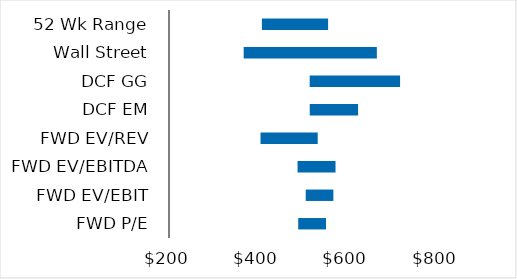
| Category | Series 0 | Series 1 | Series 2 |
|---|---|---|---|
| FWD P/E | 488.959 | 62.236 | 551.194 |
| FWD EV/EBIT | 505.742 | 62.383 | 568.125 |
| FWD EV/EBITDA | 487.494 | 85.383 | 572.877 |
| FWD EV/REV | 404.688 | 128.197 | 532.885 |
| DCF EM | 514.798 | 108.563 | 623.362 |
| DCF GG | 514.653 | 202.546 | 717.199 |
| Wall Street | 367 | 298 | 665 |
| 52 Wk Range | 407.77 | 148.5 | 556.27 |